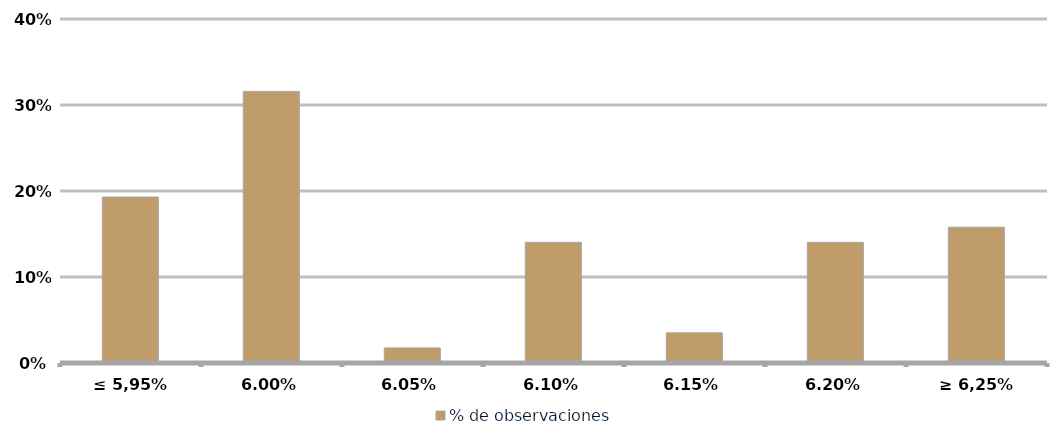
| Category | % de observaciones  |
|---|---|
| ≤ 5,95% | 0.193 |
| 6,00% | 0.316 |
| 6,05% | 0.018 |
| 6,10% | 0.14 |
| 6,15% | 0.035 |
| 6,20% | 0.14 |
| ≥ 6,25% | 0.158 |